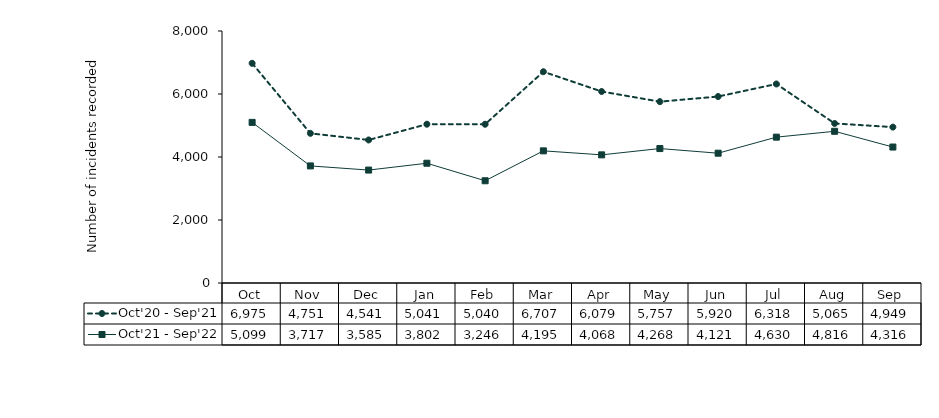
| Category | Oct'20 - Sep'21 | Oct'21 - Sep'22 |
|---|---|---|
| Oct | 6975 | 5099 |
| Nov | 4751 | 3717 |
| Dec | 4541 | 3585 |
| Jan | 5041 | 3802 |
| Feb | 5040 | 3246 |
| Mar | 6707 | 4195 |
| Apr | 6079 | 4068 |
| May | 5757 | 4268 |
| Jun | 5920 | 4121 |
| Jul | 6318 | 4630 |
| Aug | 5065 | 4816 |
| Sep | 4949 | 4316 |